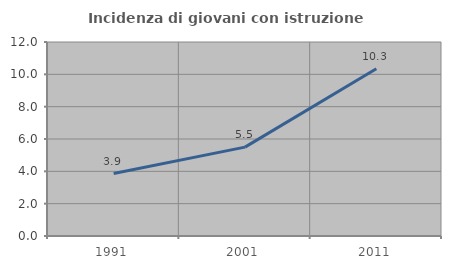
| Category | Incidenza di giovani con istruzione universitaria |
|---|---|
| 1991.0 | 3.861 |
| 2001.0 | 5.496 |
| 2011.0 | 10.343 |